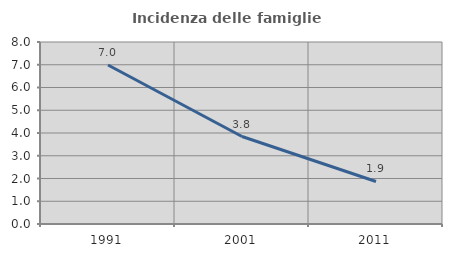
| Category | Incidenza delle famiglie numerose |
|---|---|
| 1991.0 | 6.99 |
| 2001.0 | 3.846 |
| 2011.0 | 1.868 |